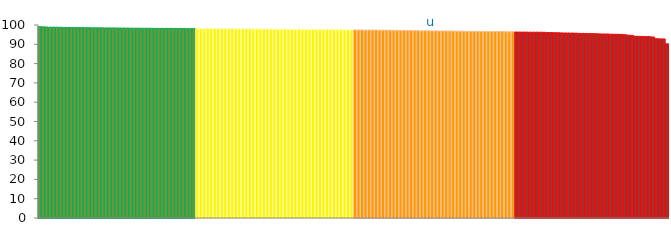
| Category | Top Quartile | 2nd Quartile | 3rd Quartile | Bottom Quartile | Series 4 |
|---|---|---|---|---|---|
|  | 99.15 | 0 | 0 | 0 | 99.15 |
|  | 99.05 | 0 | 0 | 0 | 99.05 |
|  | 98.95 | 0 | 0 | 0 | 98.95 |
|  | 98.89 | 0 | 0 | 0 | 98.89 |
|  | 98.88 | 0 | 0 | 0 | 98.88 |
|  | 98.87 | 0 | 0 | 0 | 98.87 |
|  | 98.83 | 0 | 0 | 0 | 98.83 |
|  | 98.72 | 0 | 0 | 0 | 98.72 |
|  | 98.71 | 0 | 0 | 0 | 98.71 |
|  | 98.68 | 0 | 0 | 0 | 98.68 |
|  | 98.66 | 0 | 0 | 0 | 98.66 |
|  | 98.64 | 0 | 0 | 0 | 98.64 |
|  | 98.62 | 0 | 0 | 0 | 98.62 |
|  | 98.62 | 0 | 0 | 0 | 98.62 |
|  | 98.58 | 0 | 0 | 0 | 98.58 |
|  | 98.54 | 0 | 0 | 0 | 98.54 |
|  | 98.54 | 0 | 0 | 0 | 98.54 |
|  | 98.53 | 0 | 0 | 0 | 98.53 |
|  | 98.52 | 0 | 0 | 0 | 98.52 |
|  | 98.49 | 0 | 0 | 0 | 98.49 |
|  | 98.49 | 0 | 0 | 0 | 98.49 |
|  | 98.49 | 0 | 0 | 0 | 98.49 |
|  | 98.46 | 0 | 0 | 0 | 98.46 |
|  | 98.44 | 0 | 0 | 0 | 98.44 |
|  | 98.42 | 0 | 0 | 0 | 98.42 |
|  | 98.4 | 0 | 0 | 0 | 98.4 |
|  | 98.38 | 0 | 0 | 0 | 98.38 |
|  | 98.35 | 0 | 0 | 0 | 98.35 |
|  | 98.35 | 0 | 0 | 0 | 98.35 |
|  | 98.34 | 0 | 0 | 0 | 98.34 |
|  | 98.31 | 0 | 0 | 0 | 98.31 |
|  | 98.3 | 0 | 0 | 0 | 98.3 |
|  | 98.27 | 0 | 0 | 0 | 98.27 |
|  | 98.27 | 0 | 0 | 0 | 98.27 |
|  | 98.26 | 0 | 0 | 0 | 98.26 |
|  | 98.25 | 0 | 0 | 0 | 98.25 |
|  | 98.22 | 0 | 0 | 0 | 98.22 |
|  | 98.22 | 0 | 0 | 0 | 98.22 |
|  | 98.22 | 0 | 0 | 0 | 98.22 |
|  | 98.19 | 0 | 0 | 0 | 98.19 |
|  | 98.16 | 0 | 0 | 0 | 98.16 |
|  | 98.15 | 0 | 0 | 0 | 98.15 |
|  | 98.13 | 0 | 0 | 0 | 98.13 |
|  | 98.1 | 0 | 0 | 0 | 98.1 |
|  | 98.1 | 0 | 0 | 0 | 98.1 |
|  | 0 | 98.09 | 0 | 0 | 98.09 |
|  | 0 | 98.08 | 0 | 0 | 98.08 |
|  | 0 | 98.07 | 0 | 0 | 98.07 |
|  | 0 | 98.07 | 0 | 0 | 98.07 |
|  | 0 | 98.07 | 0 | 0 | 98.07 |
|  | 0 | 98.06 | 0 | 0 | 98.06 |
|  | 0 | 98.04 | 0 | 0 | 98.04 |
|  | 0 | 98.04 | 0 | 0 | 98.04 |
|  | 0 | 98.02 | 0 | 0 | 98.02 |
|  | 0 | 98.01 | 0 | 0 | 98.01 |
|  | 0 | 98.01 | 0 | 0 | 98.01 |
|  | 0 | 97.97 | 0 | 0 | 97.97 |
|  | 0 | 97.96 | 0 | 0 | 97.96 |
|  | 0 | 97.94 | 0 | 0 | 97.94 |
|  | 0 | 97.92 | 0 | 0 | 97.92 |
|  | 0 | 97.92 | 0 | 0 | 97.92 |
|  | 0 | 97.92 | 0 | 0 | 97.92 |
|  | 0 | 97.91 | 0 | 0 | 97.91 |
|  | 0 | 97.89 | 0 | 0 | 97.89 |
|  | 0 | 97.87 | 0 | 0 | 97.87 |
|  | 0 | 97.84 | 0 | 0 | 97.84 |
|  | 0 | 97.8 | 0 | 0 | 97.8 |
|  | 0 | 97.79 | 0 | 0 | 97.79 |
|  | 0 | 97.77 | 0 | 0 | 97.77 |
|  | 0 | 97.75 | 0 | 0 | 97.75 |
|  | 0 | 97.72 | 0 | 0 | 97.72 |
|  | 0 | 97.67 | 0 | 0 | 97.67 |
|  | 0 | 97.64 | 0 | 0 | 97.64 |
|  | 0 | 97.63 | 0 | 0 | 97.63 |
|  | 0 | 97.6 | 0 | 0 | 97.6 |
|  | 0 | 97.6 | 0 | 0 | 97.6 |
|  | 0 | 97.6 | 0 | 0 | 97.6 |
|  | 0 | 97.59 | 0 | 0 | 97.59 |
|  | 0 | 97.58 | 0 | 0 | 97.58 |
|  | 0 | 97.56 | 0 | 0 | 97.56 |
|  | 0 | 97.55 | 0 | 0 | 97.55 |
|  | 0 | 97.55 | 0 | 0 | 97.55 |
|  | 0 | 97.55 | 0 | 0 | 97.55 |
|  | 0 | 97.53 | 0 | 0 | 97.53 |
|  | 0 | 97.51 | 0 | 0 | 97.51 |
|  | 0 | 97.51 | 0 | 0 | 97.51 |
|  | 0 | 97.5 | 0 | 0 | 97.5 |
|  | 0 | 97.46 | 0 | 0 | 97.46 |
|  | 0 | 97.46 | 0 | 0 | 97.46 |
|  | 0 | 97.45 | 0 | 0 | 97.45 |
|  | 0 | 0 | 97.44 | 0 | 97.44 |
|  | 0 | 0 | 97.41 | 0 | 97.41 |
|  | 0 | 0 | 97.4 | 0 | 97.4 |
|  | 0 | 0 | 97.38 | 0 | 97.38 |
|  | 0 | 0 | 97.38 | 0 | 97.38 |
|  | 0 | 0 | 97.38 | 0 | 97.38 |
|  | 0 | 0 | 97.36 | 0 | 97.36 |
|  | 0 | 0 | 97.36 | 0 | 97.36 |
|  | 0 | 0 | 97.33 | 0 | 97.33 |
|  | 0 | 0 | 97.32 | 0 | 97.32 |
|  | 0 | 0 | 97.3 | 0 | 97.3 |
|  | 0 | 0 | 97.23 | 0 | 97.23 |
|  | 0 | 0 | 97.21 | 0 | 97.21 |
|  | 0 | 0 | 97.21 | 0 | 97.21 |
|  | 0 | 0 | 97.21 | 0 | 97.21 |
|  | 0 | 0 | 97.17 | 0 | 97.17 |
|  | 0 | 0 | 97.15 | 0 | 97.15 |
|  | 0 | 0 | 97.07 | 0 | 97.07 |
|  | 0 | 0 | 97.07 | 0 | 97.07 |
|  | 0 | 0 | 96.98 | 0 | 96.98 |
|  | 0 | 0 | 96.97 | 0 | 96.97 |
|  | 0 | 0 | 96.97 | 0 | 96.97 |
| u | 0 | 0 | 96.93 | 0 | 96.93 |